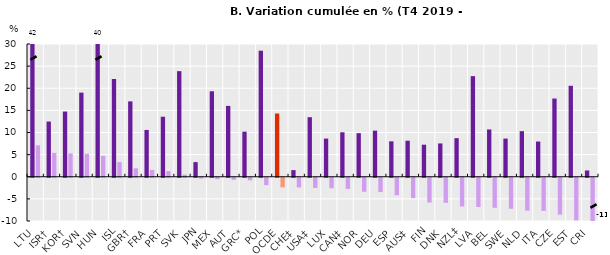
| Category | Salaire horaire nominal | Salaire horaire réel |
|---|---|---|
| LTU | 41.89 | 7.106 |
| ISR† | 12.478 | 5.393 |
| KOR† | 14.736 | 5.263 |
| SVN | 19.008 | 5.19 |
| HUN | 39.852 | 4.731 |
| ISL | 22.086 | 3.3 |
| GBR† | 17.037 | 1.908 |
| FRA | 10.575 | 1.542 |
| PRT | 13.568 | 1.253 |
| SVK | 23.866 | 0.467 |
| JPN | 3.309 | -0.178 |
| MEX | 19.321 | -0.302 |
| AUT | 16.009 | -0.476 |
| GRC* | 10.187 | -0.582 |
| POL | 28.482 | -1.668 |
| OCDE | 14.292 | -2.155 |
| CHE‡ | 1.504 | -2.186 |
| USA‡ | 13.463 | -2.295 |
| LUX | 8.626 | -2.371 |
| CAN‡ | 10.048 | -2.513 |
| NOR | 9.848 | -3.168 |
| DEU | 10.419 | -3.24 |
| ESP | 8.008 | -3.966 |
| AUS‡ | 8.146 | -4.601 |
| FIN | 7.243 | -5.601 |
| DNK | 7.528 | -5.663 |
| NZL‡ | 8.724 | -6.506 |
| LVA | 22.741 | -6.606 |
| BEL | 10.685 | -6.782 |
| SWE | 8.629 | -6.998 |
| NLD | 10.302 | -7.426 |
| ITA | 7.963 | -7.482 |
| CZE | 17.678 | -8.337 |
| EST | 20.559 | -9.635 |
| CRI | 1.422 | -10.847 |